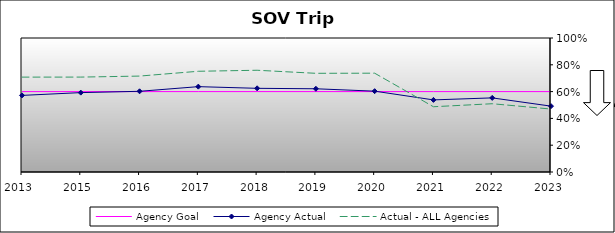
| Category | Agency Goal | Agency Actual | Actual - ALL Agencies |
|---|---|---|---|
| 2013.0 | 0.6 | 0.572 | 0.708 |
| 2015.0 | 0.6 | 0.592 | 0.708 |
| 2016.0 | 0.6 | 0.602 | 0.716 |
| 2017.0 | 0.6 | 0.637 | 0.752 |
| 2018.0 | 0.6 | 0.624 | 0.759 |
| 2019.0 | 0.6 | 0.621 | 0.736 |
| 2020.0 | 0.6 | 0.603 | 0.737 |
| 2021.0 | 0.6 | 0.538 | 0.487 |
| 2022.0 | 0.6 | 0.553 | 0.509 |
| 2023.0 | 0.6 | 0.491 | 0.47 |